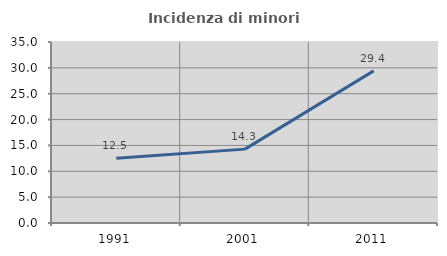
| Category | Incidenza di minori stranieri |
|---|---|
| 1991.0 | 12.5 |
| 2001.0 | 14.286 |
| 2011.0 | 29.412 |